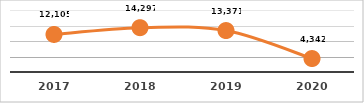
| Category | SERVICIOS TECNOLÓGICOS PROPORCIONADOS
TERCER TRIMESTRE, EJERCICIO 2020 |
|---|---|
| 2017.0 | 12105 |
| 2018.0 | 14297 |
| 2019.0 | 13371 |
| 2020.0 | 4342 |